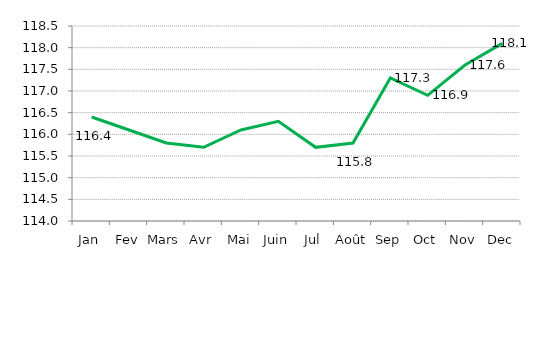
| Category |   INDICE  GENERAL     |
|---|---|
| Jan | 116.4 |
| Fev | 116.1 |
| Mars | 115.8 |
| Avr | 115.7 |
| Mai | 116.1 |
| Juin | 116.3 |
| Jul | 115.7 |
| Août | 115.8 |
| Sep | 117.3 |
| Oct | 116.9 |
| Nov | 117.6 |
| Dec | 118.1 |